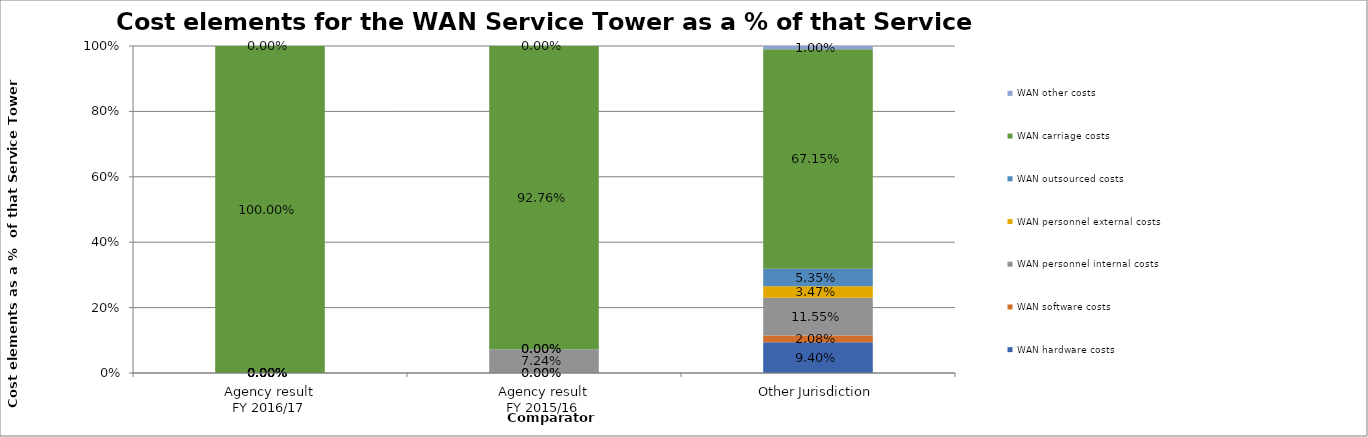
| Category | WAN hardware costs | WAN software costs | WAN personnel internal costs | WAN personnel external costs | WAN outsourced costs | WAN carriage costs | WAN other costs |
|---|---|---|---|---|---|---|---|
| Agency result
FY 2016/17 | 0 | 0 | 0 | 0 | 0 | 1 | 0 |
| Agency result
FY 2015/16 | 0 | 0 | 0.072 | 0 | 0 | 0.928 | 0 |
| Other Jurisdiction | 0.094 | 0.021 | 0.116 | 0.035 | 0.054 | 0.672 | 0.01 |